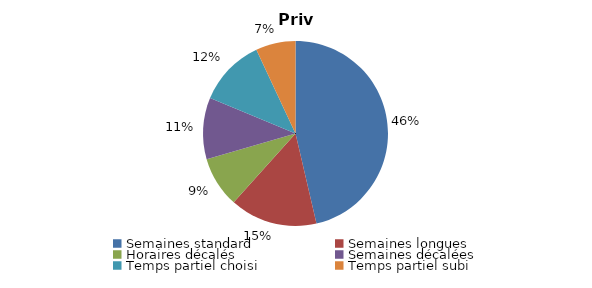
| Category | Privé | FPE |
|---|---|---|
| Semaines standard | 46.359 | 45.14 |
| Semaines longues | 15.275 | 19.788 |
| Horaires décalés | 8.884 | 4.898 |
| Semaines décalées | 10.741 | 12.83 |
| Temps partiel choisi | 11.79 | 12.093 |
| Temps partiel subi | 6.951 | 5.251 |